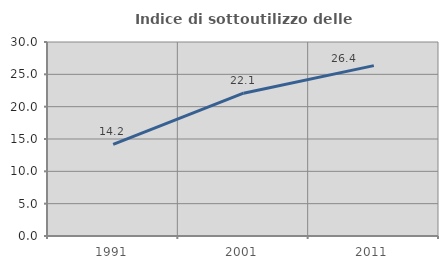
| Category | Indice di sottoutilizzo delle abitazioni  |
|---|---|
| 1991.0 | 14.18 |
| 2001.0 | 22.085 |
| 2011.0 | 26.351 |